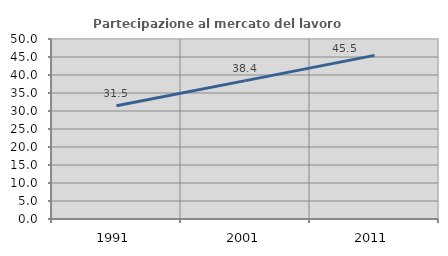
| Category | Partecipazione al mercato del lavoro  femminile |
|---|---|
| 1991.0 | 31.455 |
| 2001.0 | 38.434 |
| 2011.0 | 45.455 |